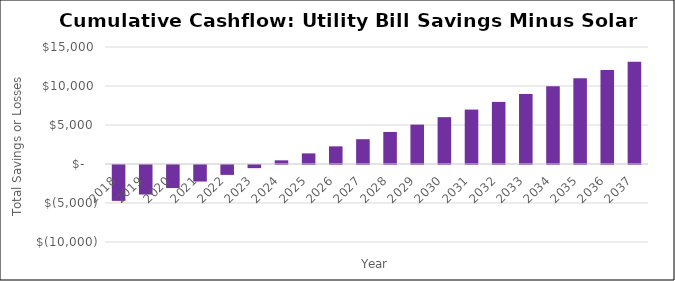
| Category | Series 0 |
|---|---|
| 2018.0 | -4597.8 |
| 2019.0 | -3783.647 |
| 2020.0 | -2957.384 |
| 2021.0 | -2118.853 |
| 2022.0 | -1267.892 |
| 2023.0 | -404.341 |
| 2024.0 | 471.964 |
| 2025.0 | 1361.188 |
| 2026.0 | 2263.497 |
| 2027.0 | 3179.059 |
| 2028.0 | 4108.042 |
| 2029.0 | 5050.618 |
| 2030.0 | 6006.959 |
| 2031.0 | 6977.237 |
| 2032.0 | 7961.629 |
| 2033.0 | 8960.311 |
| 2034.0 | 9973.459 |
| 2035.0 | 11001.255 |
| 2036.0 | 12043.878 |
| 2037.0 | 13101.509 |